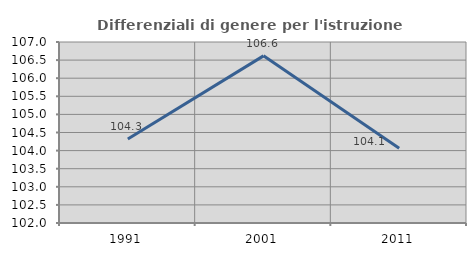
| Category | Differenziali di genere per l'istruzione superiore |
|---|---|
| 1991.0 | 104.322 |
| 2001.0 | 106.617 |
| 2011.0 | 104.064 |